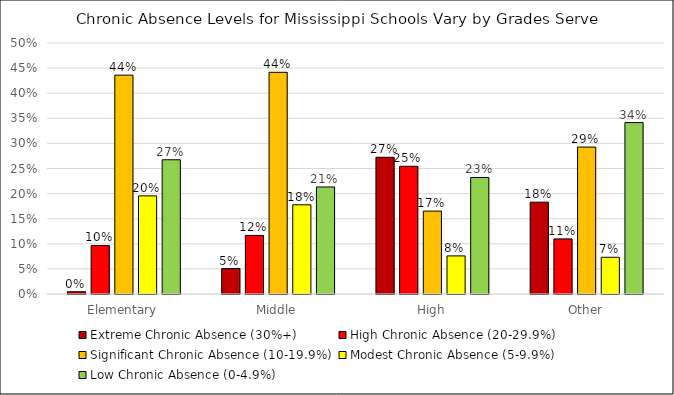
| Category | Extreme Chronic Absence (30%+) | High Chronic Absence (20-29.9%) | Significant Chronic Absence (10-19.9%) | Modest Chronic Absence (5-9.9%) | Low Chronic Absence (0-4.9%) |
|---|---|---|---|---|---|
| Elementary | 0.004 | 0.097 | 0.436 | 0.196 | 0.267 |
| Middle | 0.051 | 0.117 | 0.442 | 0.178 | 0.213 |
| High | 0.272 | 0.254 | 0.165 | 0.076 | 0.232 |
| Other | 0.183 | 0.11 | 0.293 | 0.073 | 0.341 |